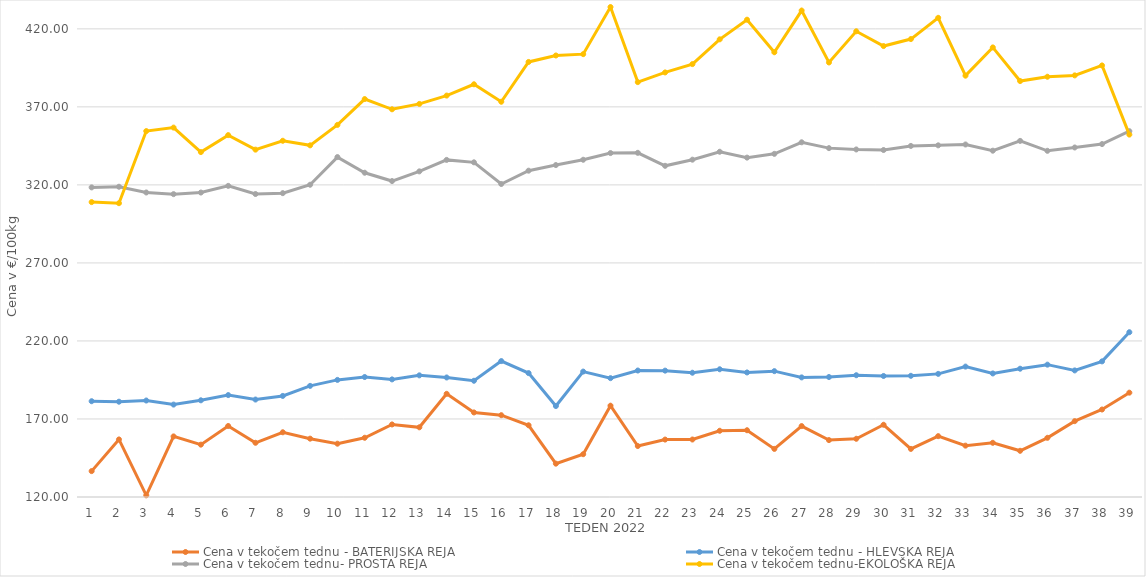
| Category | Cena v tekočem tednu - BATERIJSKA REJA | Cena v tekočem tednu - HLEVSKA REJA | Cena v tekočem tednu- PROSTA REJA | Cena v tekočem tednu-EKOLOŠKA REJA |
|---|---|---|---|---|
| 1.0 | 136.59 | 181.38 | 318.4 | 308.97 |
| 2.0 | 156.88 | 181.07 | 318.82 | 308.28 |
| 3.0 | 121.07 | 181.83 | 315.14 | 354.48 |
| 4.0 | 158.82 | 179.22 | 314.08 | 356.72 |
| 5.0 | 153.55 | 181.96 | 315.1 | 341.03 |
| 6.0 | 165.51 | 185.31 | 319.38 | 351.9 |
| 7.0 | 154.74 | 182.45 | 314.16 | 342.59 |
| 8.0 | 161.48 | 184.77 | 314.71 | 348.28 |
| 9.0 | 157.38 | 191.21 | 320.1 | 345.35 |
| 10.0 | 154.16 | 195.04 | 337.83 | 358.45 |
| 11.0 | 157.96 | 196.88 | 327.79 | 375 |
| 12.0 | 166.49 | 195.36 | 322.46 | 368.45 |
| 13.0 | 164.66 | 197.95 | 328.67 | 371.9 |
| 14.0 | 186.11 | 196.59 | 336.02 | 377.24 |
| 15.0 | 174.18 | 194.49 | 334.46 | 384.48 |
| 16.0 | 172.42 | 207.1 | 320.58 | 373.28 |
| 17.0 | 165.96 | 199.41 | 329.11 | 398.79 |
| 18.0 | 141.36 | 178.29 | 332.71 | 402.93 |
| 19.0 | 147.43 | 200.37 | 336.11 | 403.79 |
| 20.0 | 178.51 | 196.16 | 340.4 | 433.97 |
| 21.0 | 152.67 | 201.05 | 340.55 | 385.86 |
| 22.0 | 156.8 | 200.98 | 332.23 | 392.07 |
| 23.0 | 156.84 | 199.63 | 336.16 | 397.41 |
| 24.0 | 162.44 | 201.86 | 341.24 | 413.28 |
| 25.0 | 162.78 | 199.81 | 337.48 | 425.86 |
| 26.0 | 150.82 | 200.65 | 339.9 | 405 |
| 27.0 | 165.45 | 196.64 | 347.3 | 431.72 |
| 28.0 | 156.46 | 196.88 | 343.56 | 398.45 |
| 29.0 | 157.31 | 198.03 | 342.71 | 418.45 |
| 30.0 | 166.29 | 197.55 | 342.35 | 408.97 |
| 31.0 | 150.81 | 197.66 | 344.97 | 413.45 |
| 32.0 | 158.99 | 198.9 | 345.35 | 427.07 |
| 33.0 | 152.91 | 203.57 | 345.9 | 390 |
| 34.0 | 154.73 | 199.17 | 341.92 | 408.1 |
| 35.0 | 149.6 | 202.21 | 348.2 | 386.55 |
| 36.0 | 157.93 | 204.81 | 341.85 | 389.31 |
| 37.0 | 168.61 | 201.11 | 343.97 | 390.17 |
| 38.0 | 176.07 | 206.91 | 346.16 | 396.55 |
| 39.0 | 186.86 | 225.6 | 354.41 | 352.24 |